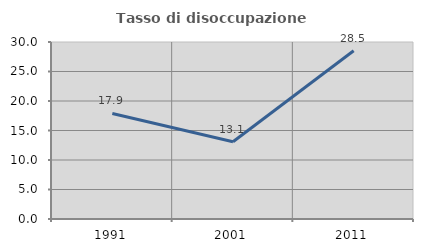
| Category | Tasso di disoccupazione giovanile  |
|---|---|
| 1991.0 | 17.895 |
| 2001.0 | 13.101 |
| 2011.0 | 28.521 |